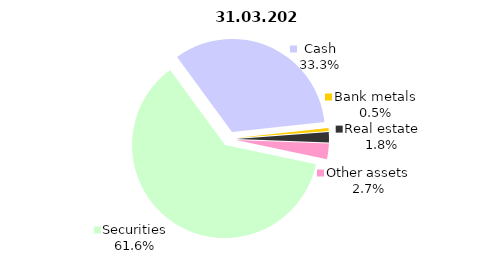
| Category | Total |
|---|---|
| Securities | 1236.78 |
| Cash | 669.349 |
| Bank metals | 10.485 |
| Real estate | 35.602 |
| Other assets | 55.073 |